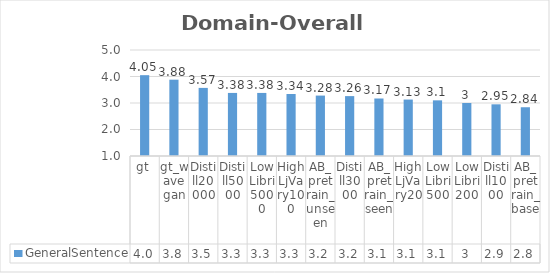
| Category | GeneralSentence |
|---|---|
| 0 | 4.05 |
| 1 | 3.88 |
| 2 | 3.57 |
| 3 | 3.38 |
| 4 | 3.38 |
| 5 | 3.34 |
| 6 | 3.28 |
| 7 | 3.26 |
| 8 | 3.17 |
| 9 | 3.13 |
| 10 | 3.1 |
| 11 | 3 |
| 12 | 2.95 |
| 13 | 2.84 |